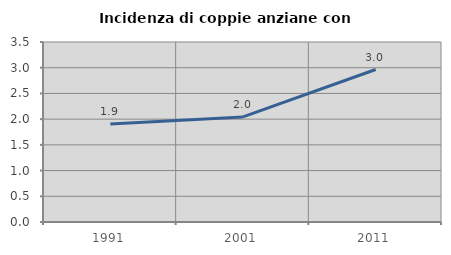
| Category | Incidenza di coppie anziane con figli |
|---|---|
| 1991.0 | 1.908 |
| 2001.0 | 2.044 |
| 2011.0 | 2.965 |